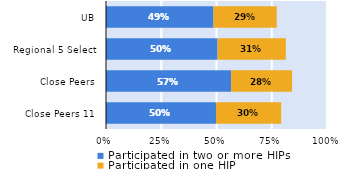
| Category | Participated in two or more HIPs | Participated in one HIP |
|---|---|---|
| Close Peers 11 | 0.498 | 0.295 |
| Close Peers | 0.566 | 0.276 |
| Regional 5 Select | 0.505 | 0.309 |
| UB | 0.486 | 0.286 |